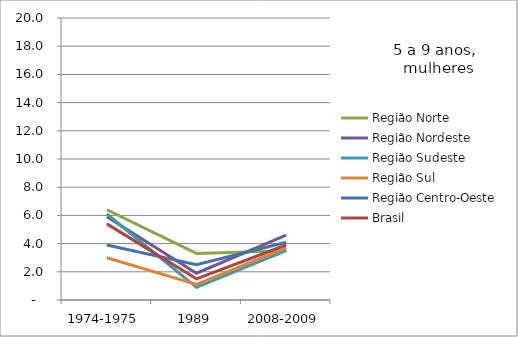
| Category | Região Norte | Região Nordeste | Região Sudeste | Região Sul | Região Centro-Oeste | Brasil |
|---|---|---|---|---|---|---|
| 1974-1975 | 6.4 | 5.9 | 6.1 | 3 | 3.9 | 5.4 |
| 1989 | 3.3 | 1.9 | 0.9 | 1.1 | 2.5 | 1.5 |
| 2008-2009 | 3.5 | 4.6 | 3.5 | 3.7 | 4.1 | 3.9 |